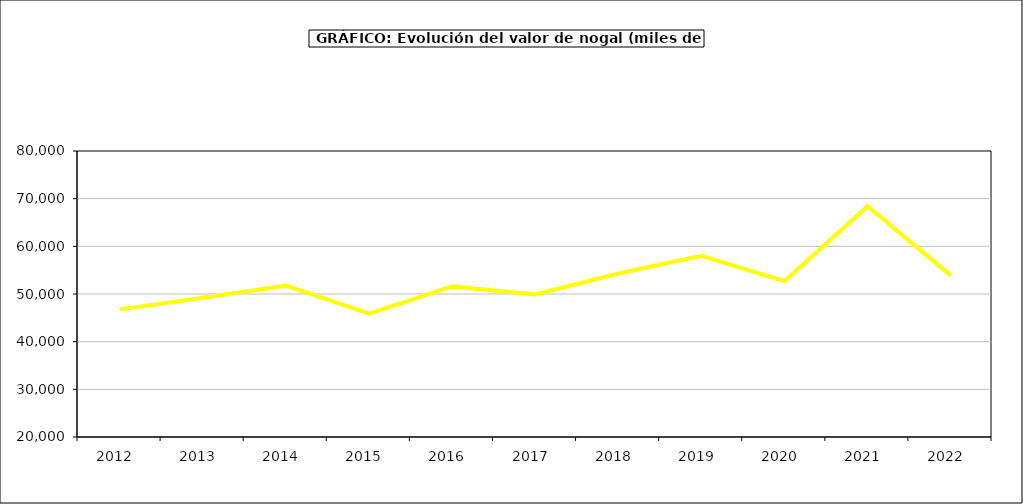
| Category | valor nogal |
|---|---|
| 2012.0 | 46777.981 |
| 2013.0 | 49217.301 |
| 2014.0 | 51776.04 |
| 2015.0 | 45857 |
| 2016.0 | 51595 |
| 2017.0 | 49891.162 |
| 2018.0 | 54304.281 |
| 2019.0 | 58028.936 |
| 2020.0 | 52678.304 |
| 2021.0 | 68411.221 |
| 2022.0 | 53912.7 |